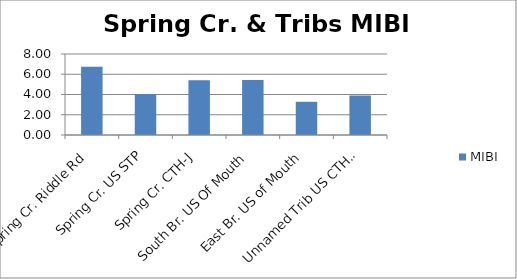
| Category | MIBI |
|---|---|
| Spring Cr. Riddle Rd | 6.75 |
| Spring Cr. US STP | 4.02 |
| Spring Cr. CTH-J | 5.41 |
| South Br. US Of Mouth | 5.44 |
| East Br. US of Mouth | 3.28 |
| Unnamed Trib US CTH-J | 3.9 |